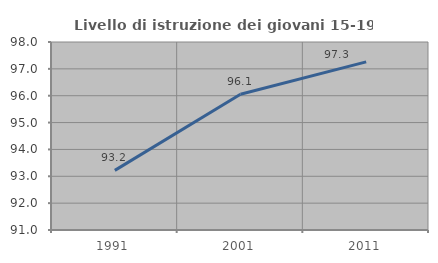
| Category | Livello di istruzione dei giovani 15-19 anni |
|---|---|
| 1991.0 | 93.22 |
| 2001.0 | 96.053 |
| 2011.0 | 97.26 |